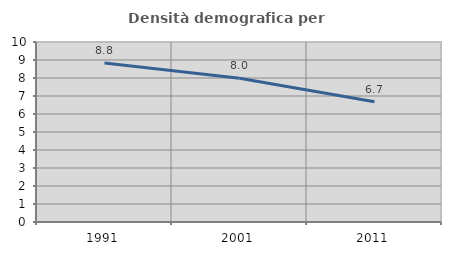
| Category | Densità demografica |
|---|---|
| 1991.0 | 8.83 |
| 2001.0 | 7.983 |
| 2011.0 | 6.679 |